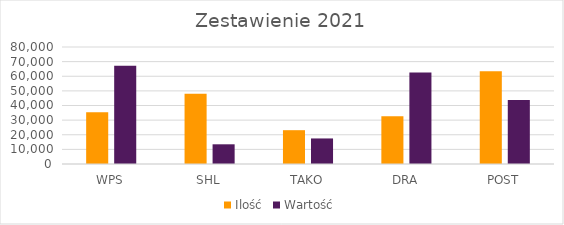
| Category | Ilość | Wartość |
|---|---|---|
| WPS | 35367 | 67137 |
| SHL | 48019 | 13470 |
| TAKO | 23121 | 17471 |
| DRA | 32568 | 62564 |
| POST | 63390 | 43765 |